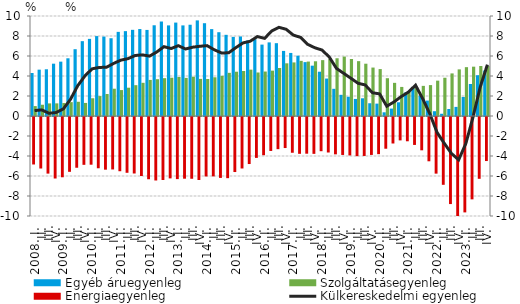
| Category | Egyéb áruegyenleg | Szolgáltatásegyenleg |
|---|---|---|
| 2008. I. | 4.299 | 0.991 |
|          II. | 4.634 | 1.126 |
|          III. | 4.673 | 1.261 |
|          IV. | 5.232 | 1.264 |
| 2009. I. | 5.436 | 1.297 |
|          II. | 5.771 | 1.387 |
|          III. | 6.679 | 1.424 |
|          IV. | 7.484 | 1.307 |
| 2010. I. | 7.713 | 1.775 |
|          II. | 7.991 | 1.992 |
|          III. | 7.944 | 2.199 |
|          IV. | 7.776 | 2.729 |
| 2011. I. | 8.414 | 2.594 |
|          II. | 8.486 | 2.83 |
|          III. | 8.617 | 3.083 |
|          IV. | 8.696 | 3.32 |
| 2012. I. | 8.607 | 3.608 |
|          II. | 9.073 | 3.681 |
|          III. | 9.448 | 3.782 |
|          IV. | 9.061 | 3.828 |
| 2013. I. | 9.341 | 3.903 |
| II. | 9.06 | 3.811 |
|          III. | 9.126 | 3.931 |
| IV. | 9.561 | 3.711 |
| 2014. I. | 9.279 | 3.702 |
| II. | 8.69 | 3.872 |
|          III. | 8.379 | 4.019 |
| IV. | 8.117 | 4.317 |
| 2015. I. | 7.912 | 4.429 |
| II. | 7.955 | 4.501 |
|          III. | 7.544 | 4.636 |
| IV. | 7.681 | 4.351 |
| 2016. I. | 7.139 | 4.446 |
| II. | 7.362 | 4.537 |
|          III. | 7.281 | 4.801 |
| IV. | 6.509 | 5.268 |
| 2017. I. | 6.306 | 5.358 |
| II. | 6.029 | 5.515 |
|          III. | 5.387 | 5.445 |
| IV. | 5.033 | 5.471 |
| 2018. I. | 4.429 | 5.587 |
| II. | 3.744 | 5.699 |
|          III. | 2.718 | 5.775 |
| IV. | 2.118 | 5.944 |
| 2019. I. | 1.924 | 5.699 |
| II. | 1.706 | 5.485 |
|          III. | 1.771 | 5.229 |
| IV. | 1.275 | 4.843 |
| 2020. I. | 1.238 | 4.692 |
| II. | 0.37 | 3.78 |
|          III. | 0.741 | 3.315 |
| IV. | 1.371 | 2.907 |
| 2021. I. | 2.353 | 2.461 |
| II. | 2.905 | 2.969 |
|          III. | 2.039 | 3.013 |
| IV. | 1.542 | 3.09 |
| 2022. I. | 0.479 | 3.535 |
| II. | 0.224 | 3.825 |
|          III. | 0.699 | 4.259 |
| IV. | 0.912 | 4.662 |
| 2023. I. | 1.903 | 4.884 |
| II. | 3.197 | 4.932 |
|          III. | 4.08 | 5.002 |
| IV. | 4.546 | 4.994 |